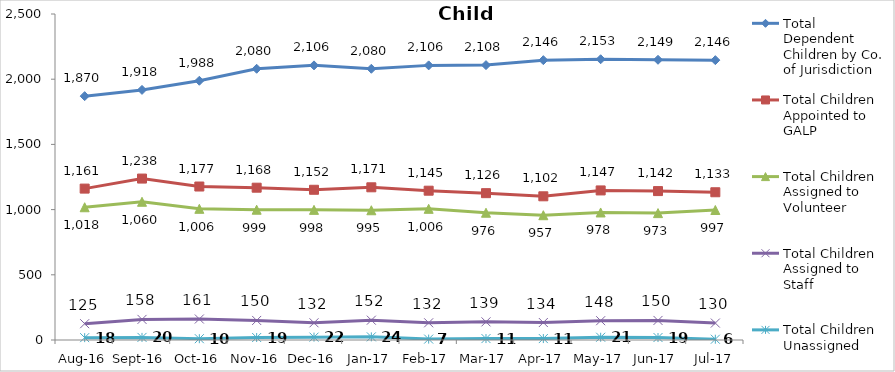
| Category | Total Dependent Children by Co. of Jurisdiction | Total Children Appointed to GALP | Total Children Assigned to Volunteer | Total Children Assigned to Staff | Total Children Unassigned |
|---|---|---|---|---|---|
| Aug-16 | 1870 | 1161 | 1018 | 125 | 18 |
| Sep-16 | 1918 | 1238 | 1060 | 158 | 20 |
| Oct-16 | 1988 | 1177 | 1006 | 161 | 10 |
| Nov-16 | 2080 | 1168 | 999 | 150 | 19 |
| Dec-16 | 2106 | 1152 | 998 | 132 | 22 |
| Jan-17 | 2080 | 1171 | 995 | 152 | 24 |
| Feb-17 | 2106 | 1145 | 1006 | 132 | 7 |
| Mar-17 | 2108 | 1126 | 976 | 139 | 11 |
| Apr-17 | 2146 | 1102 | 957 | 134 | 11 |
| May-17 | 2153 | 1147 | 978 | 148 | 21 |
| Jun-17 | 2149 | 1142 | 973 | 150 | 19 |
| Jul-17 | 2146 | 1133 | 997 | 130 | 6 |